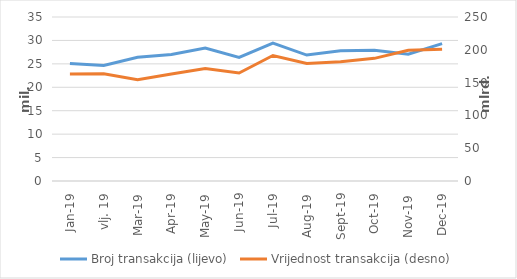
| Category | Broj transakcija (lijevo) |
|---|---|
| sij.19 | 25073175 |
| vlj. 19 | 24650098 |
| ožu.19 | 26391868 |
| tra.19 | 27012008 |
| svi.19 | 28382711 |
| lip.19 | 26372563 |
| srp.19 | 29407797 |
| kol.19 | 26879474 |
| ruj.19 | 27814364 |
| lis.19 | 27907594 |
| stu.19 | 27051008 |
| pro.19 | 29312558 |